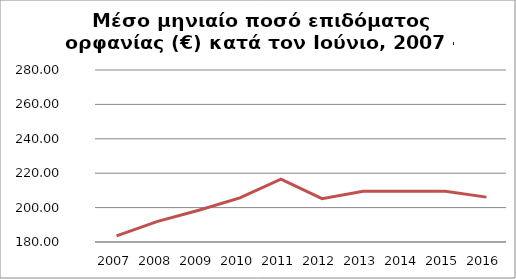
| Category | Series 1 |
|---|---|
| 2007.0 | 183.548 |
| 2008.0 | 192.013 |
| 2009.0 | 198.475 |
| 2010.0 | 205.65 |
| 2011.0 | 216.535 |
| 2012.0 | 205.197 |
| 2013.0 | 209.55 |
| 2014.0 | 209.519 |
| 2015.0 | 209.554 |
| 2016.0 | 206.09 |